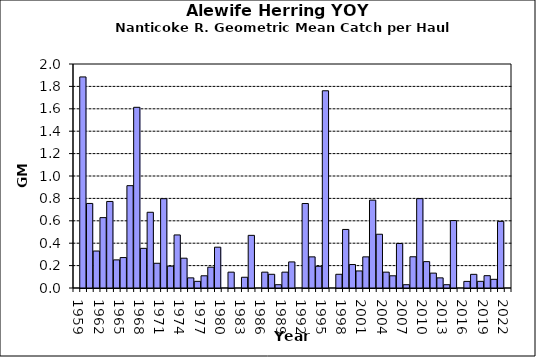
| Category | Series 0 |
|---|---|
| 1959.0 | 0 |
| 1960.0 | 1.884 |
| 1961.0 | 0.755 |
| 1962.0 | 0.33 |
| 1963.0 | 0.628 |
| 1964.0 | 0.773 |
| 1965.0 | 0.251 |
| 1966.0 | 0.272 |
| 1967.0 | 0.914 |
| 1968.0 | 1.613 |
| 1969.0 | 0.354 |
| 1970.0 | 0.676 |
| 1971.0 | 0.221 |
| 1972.0 | 0.797 |
| 1973.0 | 0.195 |
| 1974.0 | 0.474 |
| 1975.0 | 0.266 |
| 1976.0 | 0.091 |
| 1977.0 | 0.059 |
| 1978.0 | 0.109 |
| 1979.0 | 0.186 |
| 1980.0 | 0.364 |
| 1981.0 | 0 |
| 1982.0 | 0.142 |
| 1983.0 | 0 |
| 1984.0 | 0.096 |
| 1985.0 | 0.47 |
| 1986.0 | 0 |
| 1987.0 | 0.142 |
| 1988.0 | 0.122 |
| 1989.0 | 0.029 |
| 1990.0 | 0.142 |
| 1991.0 | 0.233 |
| 1992.0 | 0 |
| 1993.0 | 0.754 |
| 1994.0 | 0.278 |
| 1995.0 | 0.194 |
| 1996.0 | 1.761 |
| 1997.0 | 0 |
| 1998.0 | 0.122 |
| 1999.0 | 0.523 |
| 2000.0 | 0.209 |
| 2001.0 | 0.152 |
| 2002.0 | 0.278 |
| 2003.0 | 0.785 |
| 2004.0 | 0.48 |
| 2005.0 | 0.142 |
| 2006.0 | 0.109 |
| 2007.0 | 0.397 |
| 2008.0 | 0.029 |
| 2009.0 | 0.279 |
| 2010.0 | 0.798 |
| 2011.0 | 0.235 |
| 2012.0 | 0.133 |
| 2013.0 | 0.091 |
| 2014.0 | 0.029 |
| 2015.0 | 0.602 |
| 2016.0 | 0 |
| 2017.0 | 0.059 |
| 2018.0 | 0.122 |
| 2019.0 | 0.06 |
| 2020.0 | 0.11 |
| 2021.0 | 0.078 |
| 2022.0 | 0.595 |
| 2023.0 | 0 |